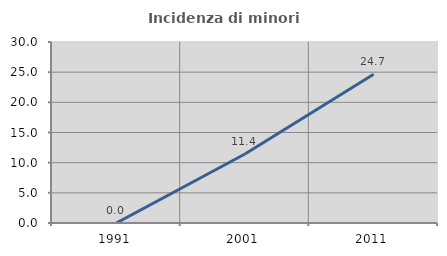
| Category | Incidenza di minori stranieri |
|---|---|
| 1991.0 | 0 |
| 2001.0 | 11.429 |
| 2011.0 | 24.658 |